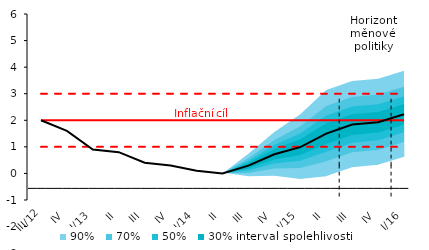
| Category | Inflation Target | Inflation Target - lower bound | Inflation Target - upper bound | Střed předpovědi |
|---|---|---|---|---|
| III/12 | 2 | 1 | 3 | 2 |
| IV | 2 | 1 | 3 | 1.6 |
| I/13 | 2 | 1 | 3 | 0.9 |
| II | 2 | 1 | 3 | 0.8 |
| III | 2 | 1 | 3 | 0.4 |
| IV | 2 | 1 | 3 | 0.3 |
| I/14 | 2 | 1 | 3 | 0.1 |
| II | 2 | 1 | 3 | 0 |
| III | 2 | 1 | 3 | 0.295 |
| IV | 2 | 1 | 3 | 0.721 |
| I/15 | 2 | 1 | 3 | 0.99 |
| II | 2 | 1 | 3 | 1.499 |
| III | 2 | 1 | 3 | 1.838 |
| IV | 2 | 1 | 3 | 1.926 |
| I/16 | 2 | 1 | 3 | 2.226 |